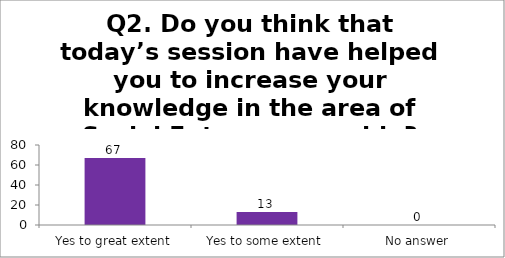
| Category | Q2. Do you think that today’s session have helped you to increase your knowledge in the area of Social Entrepreneurship? |
|---|---|
| Yes to great extent | 67 |
| Yes to some extent | 13 |
| No answer | 0 |